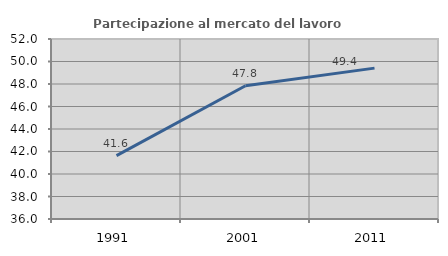
| Category | Partecipazione al mercato del lavoro  femminile |
|---|---|
| 1991.0 | 41.631 |
| 2001.0 | 47.841 |
| 2011.0 | 49.41 |